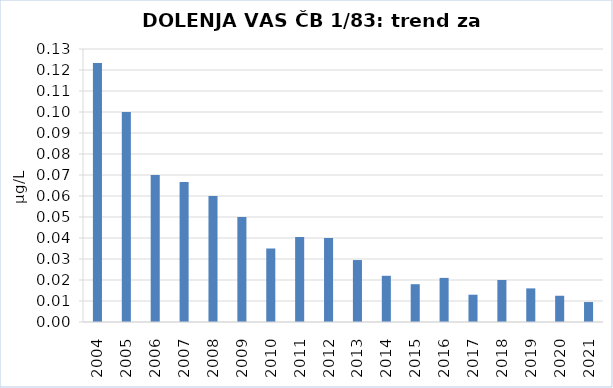
| Category | Vsota |
|---|---|
| 2004 | 0.123 |
| 2005 | 0.1 |
| 2006 | 0.07 |
| 2007 | 0.067 |
| 2008 | 0.06 |
| 2009 | 0.05 |
| 2010 | 0.035 |
| 2011 | 0.04 |
| 2012 | 0.04 |
| 2013 | 0.03 |
| 2014 | 0.022 |
| 2015 | 0.018 |
| 2016 | 0.021 |
| 2017 | 0.013 |
| 2018 | 0.02 |
| 2019 | 0.016 |
| 2020 | 0.012 |
| 2021 | 0.01 |